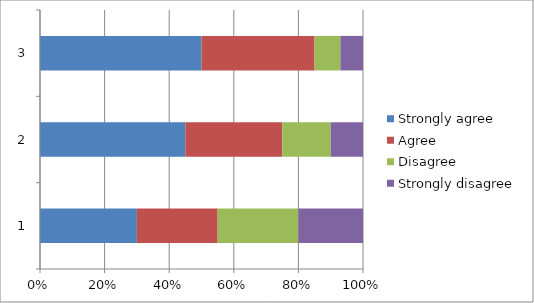
| Category | Strongly agree | Agree | Disagree | Strongly disagree |
|---|---|---|---|---|
| 0 | 0.3 | 0.25 | 0.25 | 0.2 |
| 1 | 0.45 | 0.3 | 0.15 | 0.1 |
| 2 | 0.5 | 0.35 | 0.08 | 0.07 |